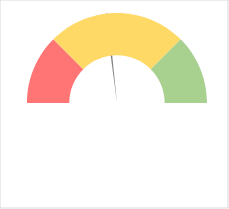
| Category | Series 1 |
|---|---|
| 0 | 0.458 |
| 1 | 0.01 |
| 2 | 1.532 |